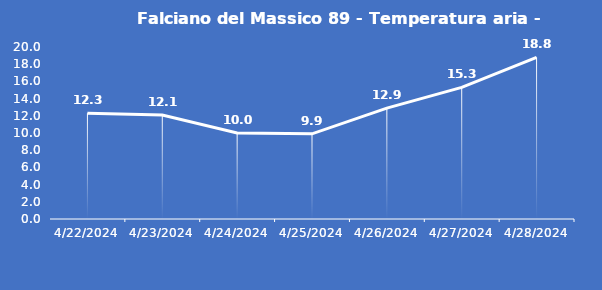
| Category | Falciano del Massico 89 - Temperatura aria - Grezzo (°C) |
|---|---|
| 4/22/24 | 12.3 |
| 4/23/24 | 12.1 |
| 4/24/24 | 10 |
| 4/25/24 | 9.9 |
| 4/26/24 | 12.9 |
| 4/27/24 | 15.3 |
| 4/28/24 | 18.8 |